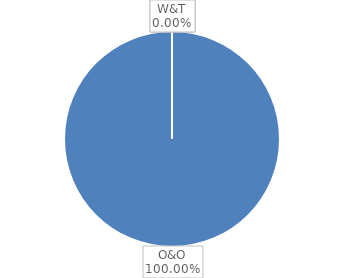
| Category | Budget |
|---|---|
| O&O | 27.242 |
| O&V | 0 |
| W&T | 0 |